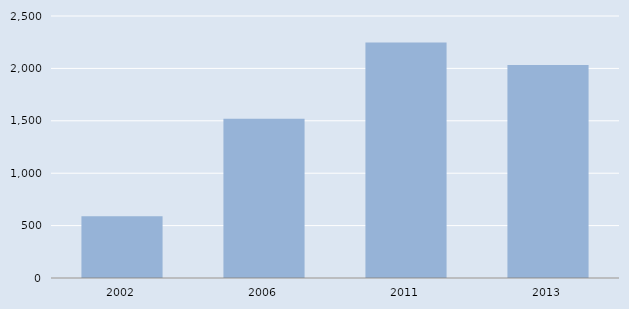
| Category | Series 0 |
|---|---|
| 2002.0 | 590 |
| 2006.0 | 1520 |
| 2011.0 | 2246 |
| 2013.0 | 2033 |